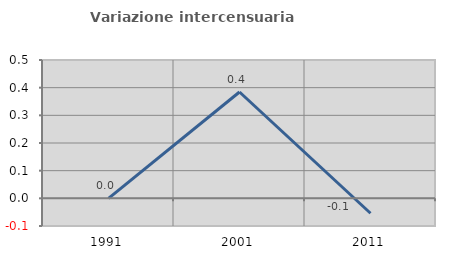
| Category | Variazione intercensuaria annua |
|---|---|
| 1991.0 | 0 |
| 2001.0 | 0.384 |
| 2011.0 | -0.054 |